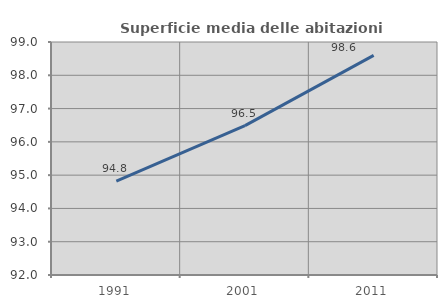
| Category | Superficie media delle abitazioni occupate |
|---|---|
| 1991.0 | 94.82 |
| 2001.0 | 96.487 |
| 2011.0 | 98.599 |